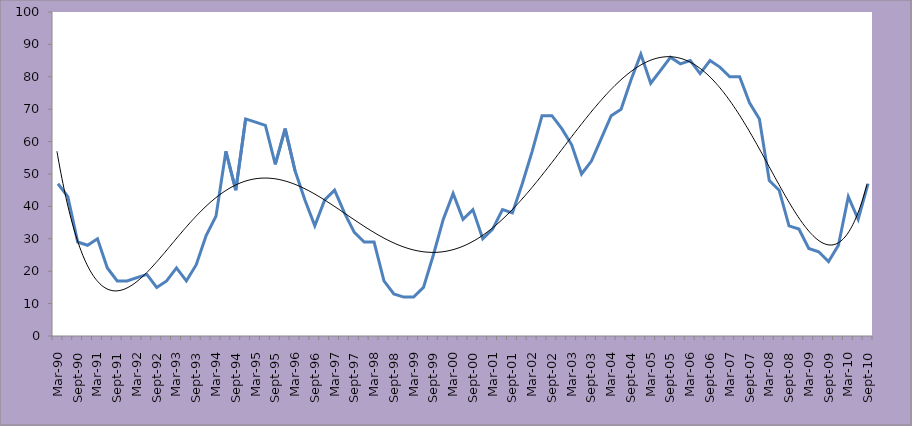
| Category | RMB/BER Business Confidence Index |
|---|---|
| Mar-90 | 47 |
| Jun-90 | 43 |
| Sep-90 | 29 |
| Dec-90 | 28 |
| Mar-91 | 30 |
| Jun-91 | 21 |
| Sep-91 | 17 |
| Dec-91 | 17 |
| Mar-92 | 18 |
| Jun-92 | 19 |
| Sep-92 | 15 |
| Dec-92 | 17 |
| Mar-93 | 21 |
| Jun-93 | 17 |
| Sep-93 | 22 |
| Dec-93 | 31 |
| Mar-94 | 37 |
| Jun-94 | 57 |
| Sep-94 | 45 |
| Dec-94 | 67 |
| Mar-95 | 66 |
| Jun-95 | 65 |
| Sep-95 | 53 |
| Dec-95 | 64 |
| Mar-96 | 51 |
| Jun-96 | 42 |
| Sep-96 | 34 |
| Dec-96 | 42 |
| Mar-97 | 45 |
| Jun-97 | 38 |
| Sep-97 | 32 |
| Dec-97 | 29 |
| Mar-98 | 29 |
| Jun-98 | 17 |
| Sep-98 | 13 |
| Dec-98 | 12 |
| Mar-99 | 12 |
| Jun-99 | 15 |
| Sep-99 | 25 |
| Dec-99 | 36 |
| Mar-00 | 44 |
| Jun-00 | 36 |
| Sep-00 | 39 |
| Dec-00 | 30 |
| Mar-01 | 33 |
| Jun-01 | 39 |
| Sep-01 | 38 |
| Dec-01 | 47 |
| Mar-02 | 57 |
| Jun-02 | 68 |
| Sep-02 | 68 |
| Dec-02 | 64 |
| Mar-03 | 59 |
| Jun-03 | 50 |
| Sep-03 | 54 |
| Dec-03 | 61 |
| Mar-04 | 68 |
| Jun-04 | 70 |
| Sep-04 | 79 |
| Dec-04 | 87 |
| Mar-05 | 78 |
| Jun-05 | 82 |
| Sep-05 | 86 |
| Dec-05 | 84 |
| Mar-06 | 85 |
| Jun-06 | 81 |
| Sep-06 | 85 |
| Dec-06 | 83 |
| Mar-07 | 80 |
| Jun-07 | 80 |
| Sep-07 | 72 |
| Dec-07 | 67 |
| Mar-08 | 48 |
| Jun-08 | 45 |
| Sep-08 | 34 |
| Dec-08 | 33 |
| Mar-09 | 27 |
| Jun-09 | 26 |
| Sep-09 | 23 |
| Dec-09 | 28 |
| Mar-10 | 43 |
| Jun-10 | 36 |
| Sep-10 | 47 |